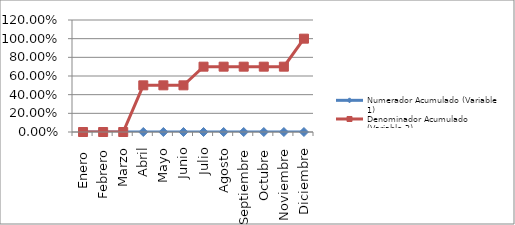
| Category | Numerador Acumulado (Variable 1) | Denominador Acumulado (Variable 2) |
|---|---|---|
| Enero  | 0 | 0 |
| Febrero | 0 | 0 |
| Marzo | 0 | 0 |
| Abril | 0 | 0.5 |
| Mayo | 0 | 0.5 |
| Junio | 0 | 0.5 |
| Julio | 0 | 0.7 |
| Agosto | 0 | 0.7 |
| Septiembre | 0 | 0.7 |
| Octubre | 0 | 0.7 |
| Noviembre | 0 | 0.7 |
| Diciembre | 0 | 1 |